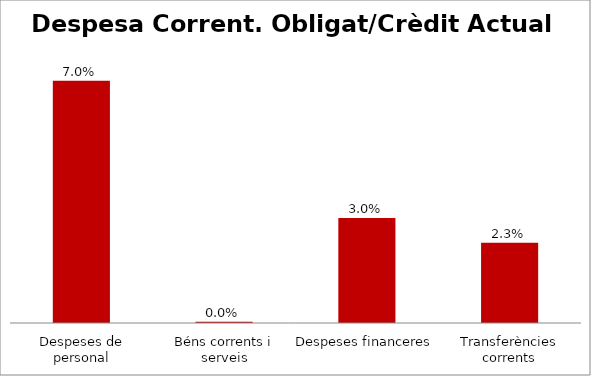
| Category | Series 0 |
|---|---|
| Despeses de personal | 0.07 |
| Béns corrents i serveis | 0 |
| Despeses financeres | 0.03 |
| Transferències corrents | 0.023 |